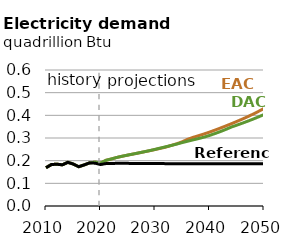
| Category | EAC | DAC | Reference |
|---|---|---|---|
| 2010.0 | 0.169 | 0.169 | 0.169 |
| 2011.0 | 0.183 | 0.183 | 0.183 |
| 2012.0 | 0.184 | 0.184 | 0.184 |
| 2013.0 | 0.182 | 0.182 | 0.182 |
| 2014.0 | 0.193 | 0.193 | 0.193 |
| 2015.0 | 0.185 | 0.185 | 0.185 |
| 2016.0 | 0.173 | 0.173 | 0.173 |
| 2017.0 | 0.181 | 0.181 | 0.181 |
| 2018.0 | 0.19 | 0.19 | 0.19 |
| 2019.0 | 0.194 | 0.194 | 0.189 |
| 2020.0 | 0.19 | 0.19 | 0.183 |
| 2021.0 | 0.202 | 0.202 | 0.187 |
| 2022.0 | 0.208 | 0.208 | 0.188 |
| 2023.0 | 0.214 | 0.214 | 0.188 |
| 2024.0 | 0.22 | 0.22 | 0.188 |
| 2025.0 | 0.225 | 0.225 | 0.188 |
| 2026.0 | 0.229 | 0.229 | 0.188 |
| 2027.0 | 0.234 | 0.234 | 0.188 |
| 2028.0 | 0.239 | 0.239 | 0.187 |
| 2029.0 | 0.244 | 0.244 | 0.187 |
| 2030.0 | 0.249 | 0.25 | 0.187 |
| 2031.0 | 0.254 | 0.256 | 0.187 |
| 2032.0 | 0.26 | 0.262 | 0.187 |
| 2033.0 | 0.267 | 0.267 | 0.187 |
| 2034.0 | 0.275 | 0.273 | 0.186 |
| 2035.0 | 0.283 | 0.28 | 0.186 |
| 2036.0 | 0.294 | 0.286 | 0.186 |
| 2037.0 | 0.303 | 0.292 | 0.186 |
| 2038.0 | 0.31 | 0.298 | 0.186 |
| 2039.0 | 0.318 | 0.304 | 0.186 |
| 2040.0 | 0.326 | 0.311 | 0.186 |
| 2041.0 | 0.335 | 0.32 | 0.186 |
| 2042.0 | 0.344 | 0.328 | 0.186 |
| 2043.0 | 0.353 | 0.338 | 0.186 |
| 2044.0 | 0.363 | 0.348 | 0.186 |
| 2045.0 | 0.373 | 0.357 | 0.186 |
| 2046.0 | 0.383 | 0.365 | 0.186 |
| 2047.0 | 0.394 | 0.374 | 0.186 |
| 2048.0 | 0.405 | 0.383 | 0.186 |
| 2049.0 | 0.418 | 0.393 | 0.186 |
| 2050.0 | 0.43 | 0.404 | 0.187 |